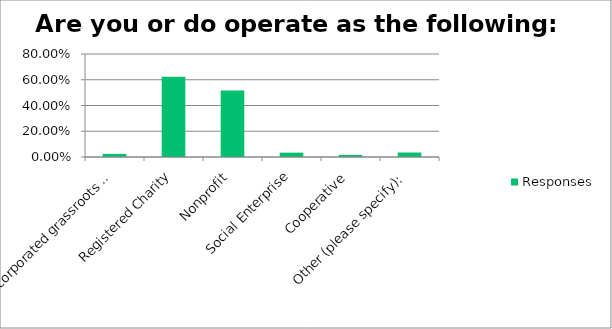
| Category | Responses |
|---|---|
| Unincorporated grassroots or community group | 0.024 |
| Registered Charity | 0.624 |
| Nonprofit | 0.516 |
| Social Enterprise | 0.034 |
| Cooperative | 0.016 |
| Other (please specify): | 0.035 |